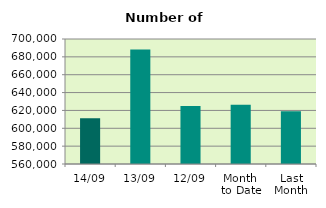
| Category | Series 0 |
|---|---|
| 14/09 | 611196 |
| 13/09 | 688328 |
| 12/09 | 624948 |
| Month 
to Date | 626291.8 |
| Last
Month | 618945.565 |